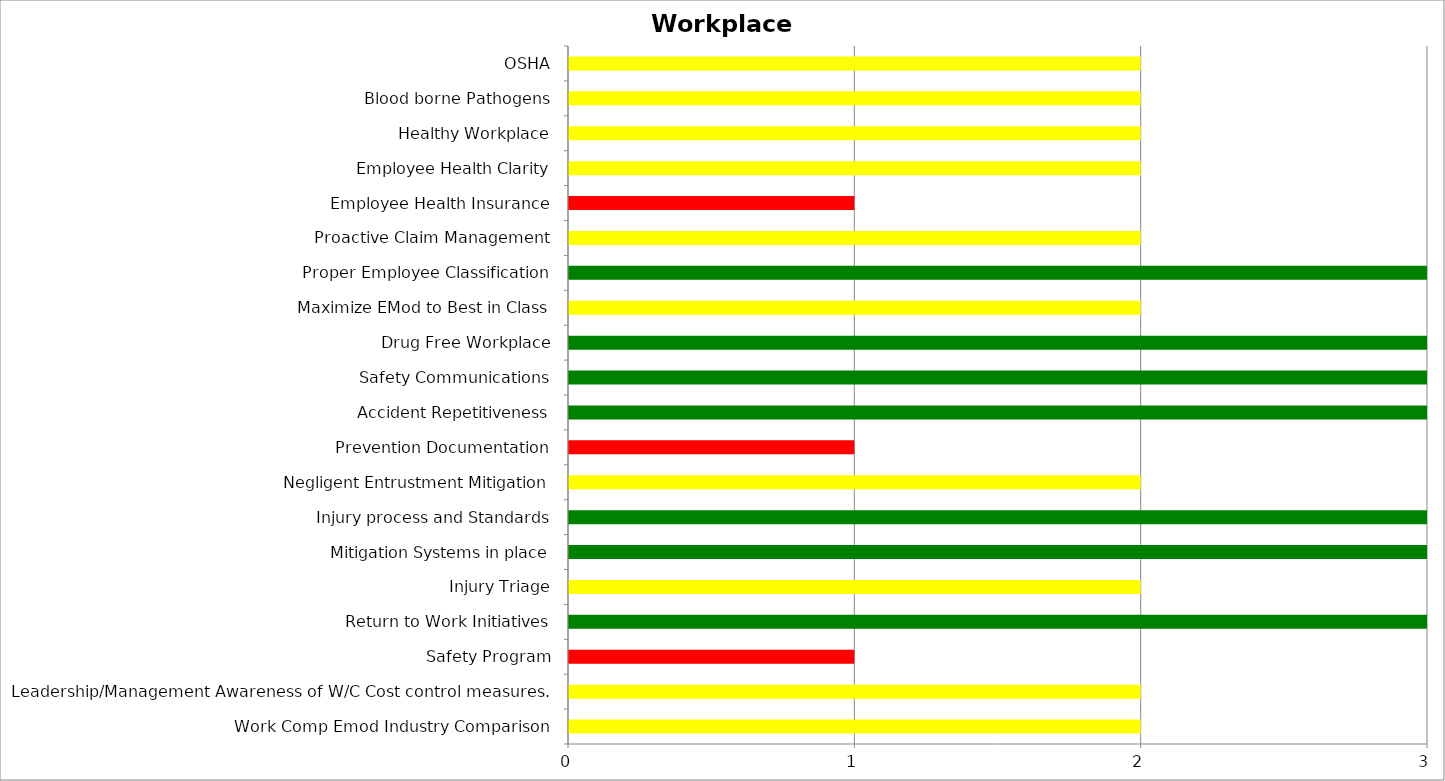
| Category | Series 0 | Medium | High |
|---|---|---|---|
| Work Comp Emod Industry Comparison | 0 | 2 | 0 |
| Leadership/Management Awareness of W/C Cost control measures. | 0 | 2 | 0 |
| Safety Program | 0 | 0 | 1 |
| Return to Work Initiatives | 3 | 0 | 0 |
| Injury Triage | 0 | 2 | 0 |
| Mitigation Systems in place | 3 | 0 | 0 |
| Injury process and Standards | 3 | 0 | 0 |
| Negligent Entrustment Mitigation | 0 | 2 | 0 |
| Prevention Documentation | 0 | 0 | 1 |
| Accident Repetitiveness | 3 | 0 | 0 |
| Safety Communications | 3 | 0 | 0 |
| Drug Free Workplace | 3 | 0 | 0 |
| Maximize EMod to Best in Class | 0 | 2 | 0 |
| Proper Employee Classification | 3 | 0 | 0 |
| Proactive Claim Management | 0 | 2 | 0 |
| Employee Health Insurance | 0 | 0 | 1 |
| Employee Health Clarity | 0 | 2 | 0 |
| Healthy Workplace | 0 | 2 | 0 |
| Blood borne Pathogens | 0 | 2 | 0 |
| OSHA | 0 | 2 | 0 |